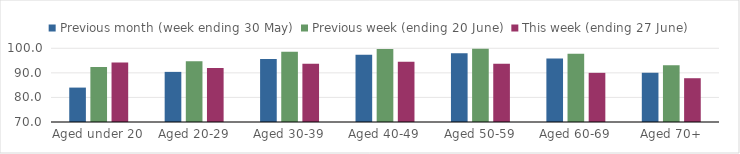
| Category | Previous month (week ending 30 May) | Previous week (ending 20 June) | This week (ending 27 June) |
|---|---|---|---|
| Aged under 20 | 84.006 | 92.412 | 94.206 |
| Aged 20-29 | 90.397 | 94.696 | 91.956 |
| Aged 30-39 | 95.637 | 98.634 | 93.693 |
| Aged 40-49 | 97.404 | 99.705 | 94.547 |
| Aged 50-59 | 97.95 | 99.773 | 93.683 |
| Aged 60-69 | 95.834 | 97.729 | 90.006 |
| Aged 70+ | 90.045 | 93.07 | 87.818 |